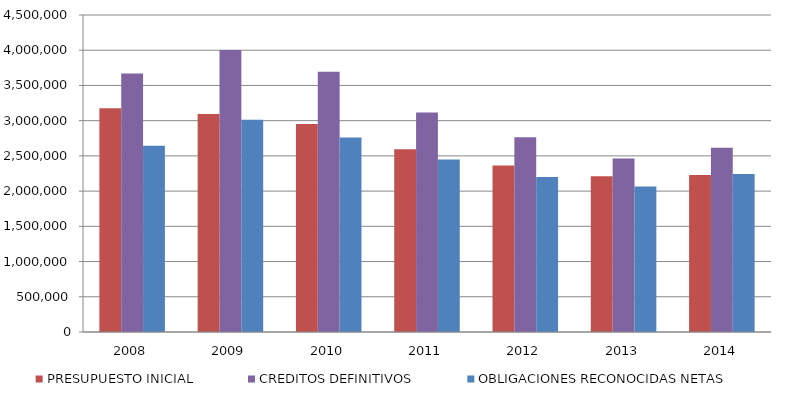
| Category | PRESUPUESTO INICIAL | CREDITOS DEFINITIVOS | OBLIGACIONES RECONOCIDAS NETAS |
|---|---|---|---|
| 2008.0 | 3175728.728 | 3670463.29 | 2643099.68 |
| 2009.0 | 3093843.317 | 4003672.99 | 3013196.1 |
| 2010.0 | 2954216.153 | 3695312.622 | 2760471.816 |
| 2011.0 | 2594698.339 | 3115266.712 | 2449416.224 |
| 2012.0 | 2362389.293 | 2763980.265 | 2200272.47 |
| 2013.0 | 2209300.484 | 2462534.405 | 2067080.929 |
| 2014.0 | 2230001.37 | 2616999.566 | 2243846.616 |